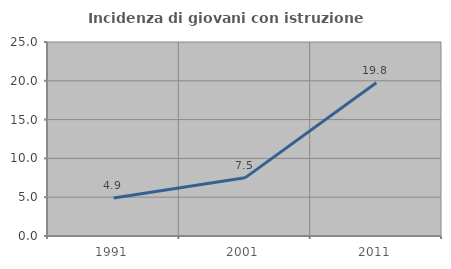
| Category | Incidenza di giovani con istruzione universitaria |
|---|---|
| 1991.0 | 4.887 |
| 2001.0 | 7.493 |
| 2011.0 | 19.753 |